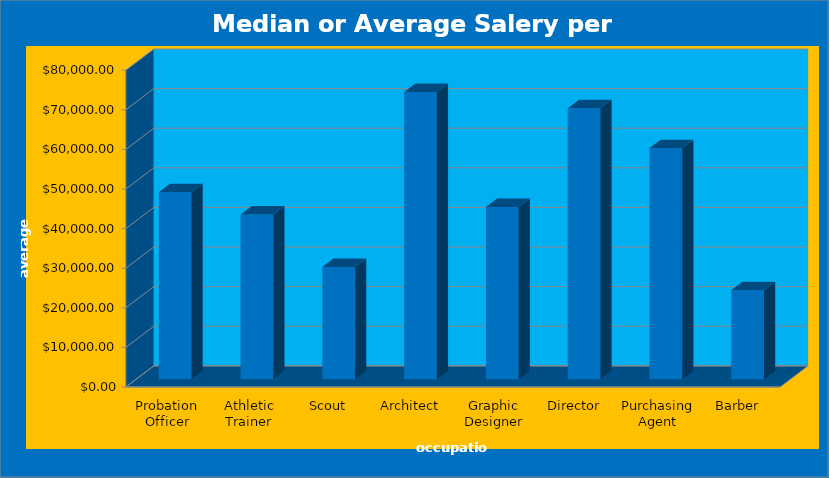
| Category | Median or Average Salery per Career Average Salary |
|---|---|
| Probation Officer | 47200 |
| Athletic Trainer | 41600 |
| Scout | 28340 |
| Architect | 72550 |
| Graphic Designer | 43500 |
| Director | 68440 |
| Purchasing Agent | 58360 |
| Barber | 22500 |